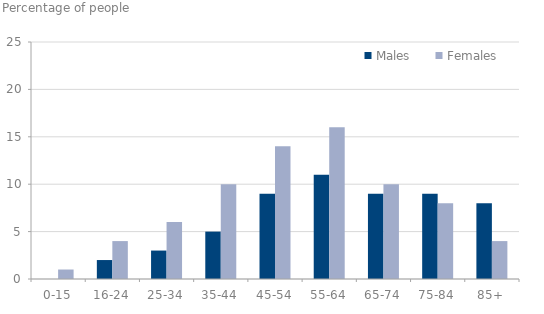
| Category | Males | Females |
|---|---|---|
| 0 | 0 | 1 |
| 1 | 2 | 4 |
| 2 | 3 | 6 |
| 3 | 5 | 10 |
| 4 | 9 | 14 |
| 5 | 11 | 16 |
| 6 | 9 | 10 |
| 7 | 9 | 8 |
| 8 | 8 | 4 |